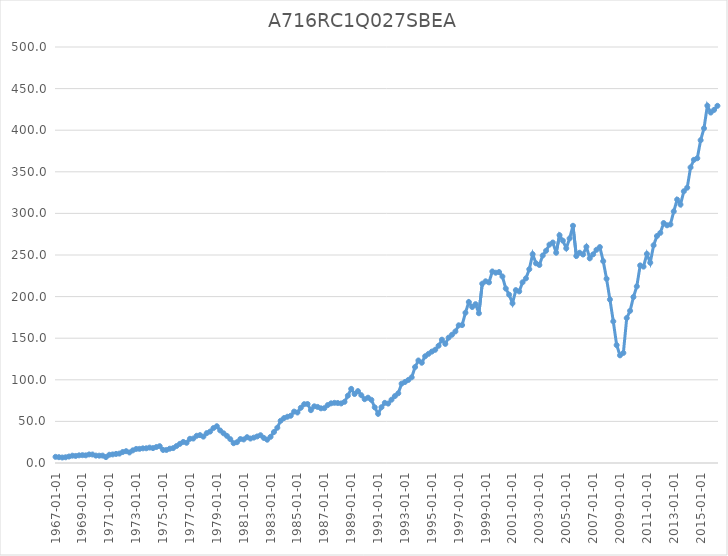
| Category | A716RC1Q027SBEA |
|---|---|
| 1967-01-01 | 7.4 |
| 1967-04-01 | 7 |
| 1967-07-01 | 6.6 |
| 1967-10-01 | 6.9 |
| 1968-01-01 | 7.8 |
| 1968-04-01 | 8.8 |
| 1968-07-01 | 8.5 |
| 1968-10-01 | 9.2 |
| 1969-01-01 | 9.4 |
| 1969-04-01 | 9.2 |
| 1969-07-01 | 10.3 |
| 1969-10-01 | 10.2 |
| 1970-01-01 | 8.9 |
| 1970-04-01 | 8.8 |
| 1970-07-01 | 8.9 |
| 1970-10-01 | 7.1 |
| 1971-01-01 | 9.9 |
| 1971-04-01 | 10.3 |
| 1971-07-01 | 10.9 |
| 1971-10-01 | 11.3 |
| 1972-01-01 | 13.2 |
| 1972-04-01 | 14.2 |
| 1972-07-01 | 12.7 |
| 1972-10-01 | 15.2 |
| 1973-01-01 | 16.9 |
| 1973-04-01 | 17 |
| 1973-07-01 | 17.6 |
| 1973-10-01 | 17.7 |
| 1974-01-01 | 18.5 |
| 1974-04-01 | 17.9 |
| 1974-07-01 | 19.2 |
| 1974-10-01 | 20.2 |
| 1975-01-01 | 15.7 |
| 1975-04-01 | 15.7 |
| 1975-07-01 | 17.2 |
| 1975-10-01 | 17.9 |
| 1976-01-01 | 20.4 |
| 1976-04-01 | 23 |
| 1976-07-01 | 25.3 |
| 1976-10-01 | 24.3 |
| 1977-01-01 | 29.1 |
| 1977-04-01 | 29.4 |
| 1977-07-01 | 32.7 |
| 1977-10-01 | 33.5 |
| 1978-01-01 | 31.7 |
| 1978-04-01 | 35.9 |
| 1978-07-01 | 37.8 |
| 1978-10-01 | 42 |
| 1979-01-01 | 44.2 |
| 1979-04-01 | 39.1 |
| 1979-07-01 | 35.7 |
| 1979-10-01 | 32.6 |
| 1980-01-01 | 28.7 |
| 1980-04-01 | 23.8 |
| 1980-07-01 | 25 |
| 1980-10-01 | 28.8 |
| 1981-01-01 | 28.3 |
| 1981-04-01 | 31 |
| 1981-07-01 | 29.4 |
| 1981-10-01 | 30.5 |
| 1982-01-01 | 31.9 |
| 1982-04-01 | 33.4 |
| 1982-07-01 | 30.1 |
| 1982-10-01 | 28 |
| 1983-01-01 | 31.5 |
| 1983-04-01 | 37.2 |
| 1983-07-01 | 42.4 |
| 1983-10-01 | 50.8 |
| 1984-01-01 | 54 |
| 1984-04-01 | 55.6 |
| 1984-07-01 | 56.8 |
| 1984-10-01 | 61.8 |
| 1985-01-01 | 60.7 |
| 1985-04-01 | 66.4 |
| 1985-07-01 | 70.7 |
| 1985-10-01 | 70.9 |
| 1986-01-01 | 63.5 |
| 1986-04-01 | 68.1 |
| 1986-07-01 | 67.4 |
| 1986-10-01 | 65.7 |
| 1987-01-01 | 65.9 |
| 1987-04-01 | 69.6 |
| 1987-07-01 | 71.7 |
| 1987-10-01 | 72.3 |
| 1988-01-01 | 72.1 |
| 1988-04-01 | 71.6 |
| 1988-07-01 | 73.5 |
| 1988-10-01 | 80.9 |
| 1989-01-01 | 89.1 |
| 1989-04-01 | 82.9 |
| 1989-07-01 | 86.4 |
| 1989-10-01 | 81.5 |
| 1990-01-01 | 76.7 |
| 1990-04-01 | 78.5 |
| 1990-07-01 | 75.9 |
| 1990-10-01 | 66.9 |
| 1991-01-01 | 59.1 |
| 1991-04-01 | 67 |
| 1991-07-01 | 72.3 |
| 1991-10-01 | 71.4 |
| 1992-01-01 | 76.1 |
| 1992-04-01 | 80.4 |
| 1992-07-01 | 83.8 |
| 1992-10-01 | 95.4 |
| 1993-01-01 | 97.4 |
| 1993-04-01 | 99.8 |
| 1993-07-01 | 103 |
| 1993-10-01 | 115.3 |
| 1994-01-01 | 123.2 |
| 1994-04-01 | 120.5 |
| 1994-07-01 | 128.3 |
| 1994-10-01 | 131.2 |
| 1995-01-01 | 133.9 |
| 1995-04-01 | 136.1 |
| 1995-07-01 | 140.9 |
| 1995-10-01 | 148.2 |
| 1996-01-01 | 143.2 |
| 1996-04-01 | 150.7 |
| 1996-07-01 | 154.2 |
| 1996-10-01 | 158.1 |
| 1997-01-01 | 165.5 |
| 1997-04-01 | 165.8 |
| 1997-07-01 | 180.6 |
| 1997-10-01 | 193.5 |
| 1998-01-01 | 187.5 |
| 1998-04-01 | 190.9 |
| 1998-07-01 | 180 |
| 1998-10-01 | 215.5 |
| 1999-01-01 | 218.4 |
| 1999-04-01 | 217.1 |
| 1999-07-01 | 230.2 |
| 1999-10-01 | 228.7 |
| 2000-01-01 | 229.5 |
| 2000-04-01 | 224.2 |
| 2000-07-01 | 209.7 |
| 2000-10-01 | 202.3 |
| 2001-01-01 | 191.9 |
| 2001-04-01 | 207.8 |
| 2001-07-01 | 206.2 |
| 2001-10-01 | 217.2 |
| 2002-01-01 | 221.9 |
| 2002-04-01 | 232.9 |
| 2002-07-01 | 251 |
| 2002-10-01 | 240 |
| 2003-01-01 | 238 |
| 2003-04-01 | 249.4 |
| 2003-07-01 | 255.1 |
| 2003-10-01 | 262.5 |
| 2004-01-01 | 265 |
| 2004-04-01 | 252.7 |
| 2004-07-01 | 273.8 |
| 2004-10-01 | 267.2 |
| 2005-01-01 | 258 |
| 2005-04-01 | 269.9 |
| 2005-07-01 | 285.1 |
| 2005-10-01 | 248.8 |
| 2006-01-01 | 252.7 |
| 2006-04-01 | 250.6 |
| 2006-07-01 | 259.9 |
| 2006-10-01 | 246 |
| 2007-01-01 | 250.8 |
| 2007-04-01 | 256.3 |
| 2007-07-01 | 259.5 |
| 2007-10-01 | 242.6 |
| 2008-01-01 | 221.4 |
| 2008-04-01 | 196.5 |
| 2008-07-01 | 170.2 |
| 2008-10-01 | 141.7 |
| 2009-01-01 | 129.4 |
| 2009-04-01 | 132.3 |
| 2009-07-01 | 174.2 |
| 2009-10-01 | 182.9 |
| 2010-01-01 | 199.5 |
| 2010-04-01 | 212.3 |
| 2010-07-01 | 237.5 |
| 2010-10-01 | 236 |
| 2011-01-01 | 251.3 |
| 2011-04-01 | 240.7 |
| 2011-07-01 | 261.7 |
| 2011-10-01 | 272.8 |
| 2012-01-01 | 276.6 |
| 2012-04-01 | 288.4 |
| 2012-07-01 | 285.7 |
| 2012-10-01 | 286.7 |
| 2013-01-01 | 302.4 |
| 2013-04-01 | 316.6 |
| 2013-07-01 | 310.6 |
| 2013-10-01 | 326.6 |
| 2014-01-01 | 330.9 |
| 2014-04-01 | 355.3 |
| 2014-07-01 | 364.4 |
| 2014-10-01 | 366.3 |
| 2015-01-01 | 388 |
| 2015-04-01 | 402.3 |
| 2015-07-01 | 429.5 |
| 2015-10-01 | 421.2 |
| 2016-01-01 | 424.4 |
| 2016-04-01 | 429.3 |